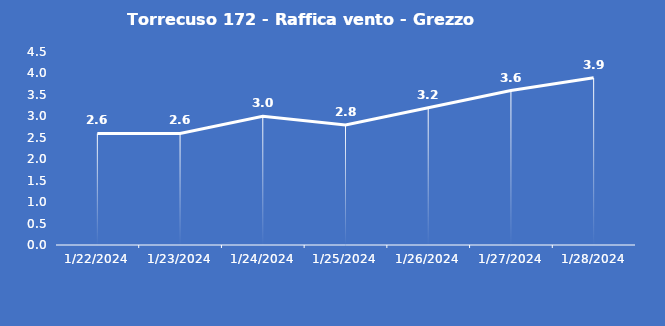
| Category | Torrecuso 172 - Raffica vento - Grezzo (m/s) |
|---|---|
| 1/22/24 | 2.6 |
| 1/23/24 | 2.6 |
| 1/24/24 | 3 |
| 1/25/24 | 2.8 |
| 1/26/24 | 3.2 |
| 1/27/24 | 3.6 |
| 1/28/24 | 3.9 |